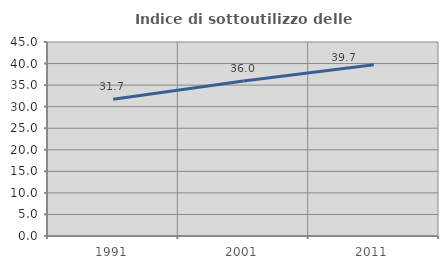
| Category | Indice di sottoutilizzo delle abitazioni  |
|---|---|
| 1991.0 | 31.741 |
| 2001.0 | 35.957 |
| 2011.0 | 39.705 |